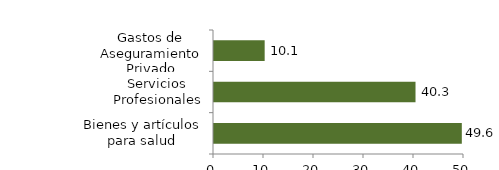
| Category | Salud |
|---|---|
| Bienes y artículos para salud | 49.564 |
| Servicios Profesionales | 40.303 |
| Gastos de Aseguramiento Privado | 10.134 |